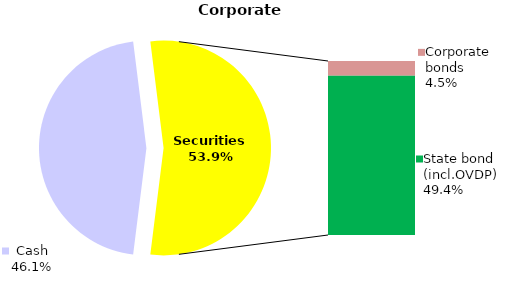
| Category | Corporate |
|---|---|
| Cash | 110.476 |
| Bank metals | 0 |
| Real estate | 0 |
| Other assets | 0 |
| Equities | 0.049 |
| Corporate bonds | 10.854 |
| Municipal bonds | 0 |
| State bond (incl.OVDP) | 118.49 |